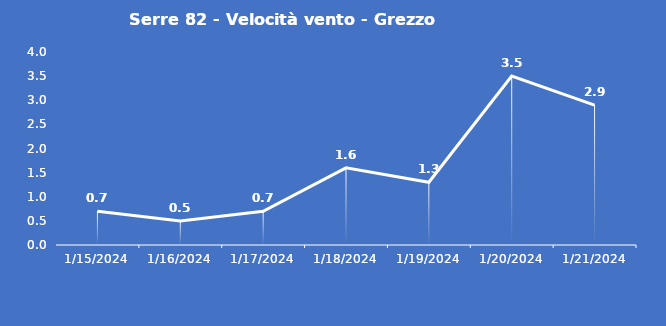
| Category | Serre 82 - Velocità vento - Grezzo (m/s) |
|---|---|
| 1/15/24 | 0.7 |
| 1/16/24 | 0.5 |
| 1/17/24 | 0.7 |
| 1/18/24 | 1.6 |
| 1/19/24 | 1.3 |
| 1/20/24 | 3.5 |
| 1/21/24 | 2.9 |